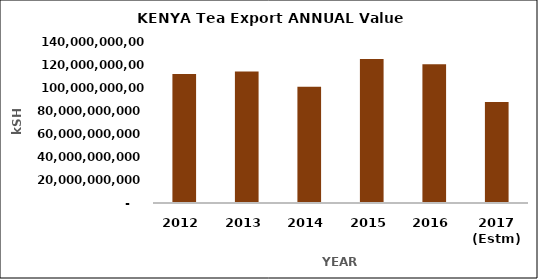
| Category | Tea Export Value (Ksh) |
|---|---|
| 2012 | 112255887259.81 |
| 2013 | 114408409065.25 |
| 2014 | 101116588984.46 |
| 2015 | 125251787850.71 |
| 2016 | 120695558063.46 |
| 2017 (Estm) | 87795246879.86 |